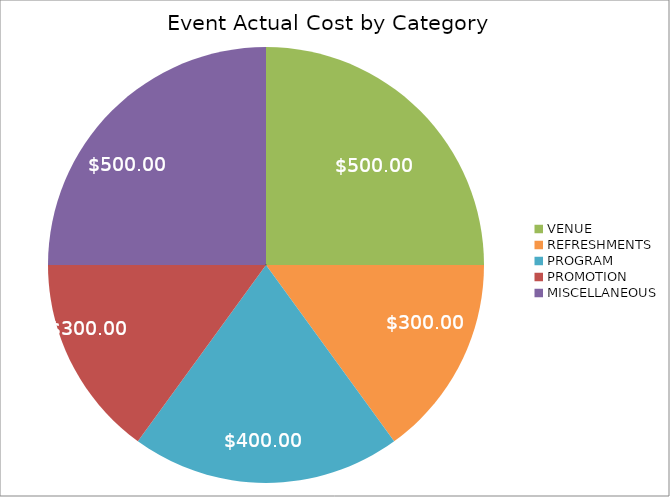
| Category | Actual |
|---|---|
| VENUE | 500 |
| REFRESHMENTS | 300 |
| PROGRAM | 400 |
| PROMOTION | 300 |
| MISCELLANEOUS | 500 |